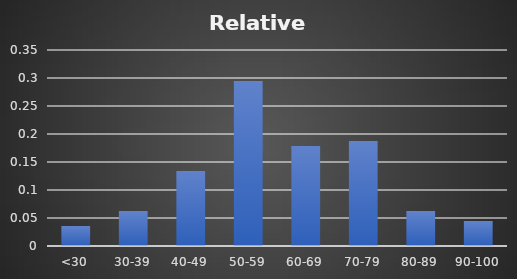
| Category | Relative Frequency |
|---|---|
| <30 | 0.036 |
| 30-39 | 0.062 |
| 40-49 | 0.134 |
| 50-59 | 0.295 |
| 60-69 | 0.179 |
| 70-79 | 0.188 |
| 80-89 | 0.062 |
| 90-100 | 0.045 |